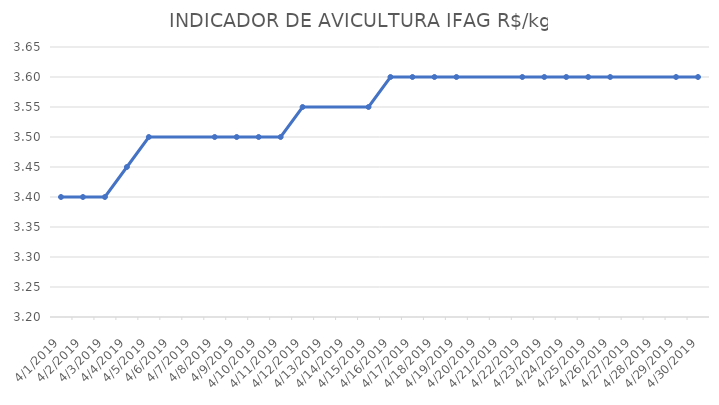
| Category | INDICADOR DE AVICULTURA IFAG |
|---|---|
| 4/1/19 | 3.4 |
| 4/2/19 | 3.4 |
| 4/3/19 | 3.4 |
| 4/4/19 | 3.45 |
| 4/5/19 | 3.5 |
| 4/8/19 | 3.5 |
| 4/9/19 | 3.5 |
| 4/10/19 | 3.5 |
| 4/11/19 | 3.5 |
| 4/12/19 | 3.55 |
| 4/15/19 | 3.55 |
| 4/16/19 | 3.6 |
| 4/17/19 | 3.6 |
| 4/18/19 | 3.6 |
| 4/19/19 | 3.6 |
| 4/22/19 | 3.6 |
| 4/23/19 | 3.6 |
| 4/24/19 | 3.6 |
| 4/25/19 | 3.6 |
| 4/26/19 | 3.6 |
| 4/29/19 | 3.6 |
| 4/30/19 | 3.6 |